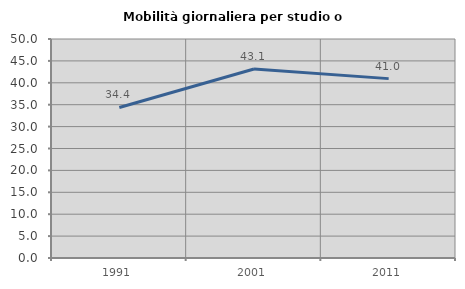
| Category | Mobilità giornaliera per studio o lavoro |
|---|---|
| 1991.0 | 34.366 |
| 2001.0 | 43.147 |
| 2011.0 | 40.952 |